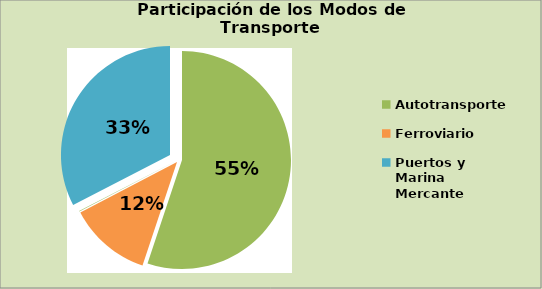
| Category | Series 0 |
|---|---|
| Autotransporte | 485502 |
| Ferroviario | 107690 |
| Aéreo | 568 |
| Puertos y Marina Mercante | 286976 |